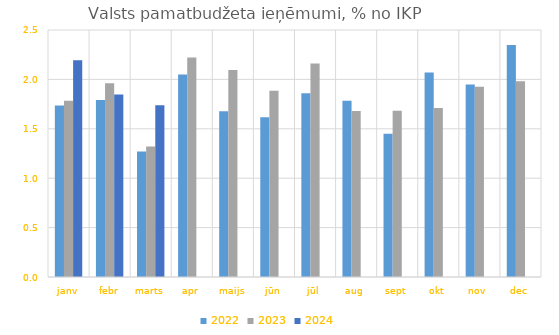
| Category | 2022 | 2023 | 2024 |
|---|---|---|---|
| janv | 1.737 | 1.784 | 2.195 |
| febr | 1.792 | 1.962 | 1.848 |
| marts | 1.27 | 1.322 | 1.74 |
| apr | 2.05 | 2.221 | 0 |
| maijs | 1.678 | 2.095 | 0 |
| jūn | 1.616 | 1.885 | 0 |
| jūl | 1.86 | 2.16 | 0 |
| aug | 1.785 | 1.68 | 0 |
| sept | 1.449 | 1.682 | 0 |
| okt | 2.069 | 1.71 | 0 |
| nov | 1.949 | 1.926 | 0 |
| dec | 2.347 | 1.98 | 0 |